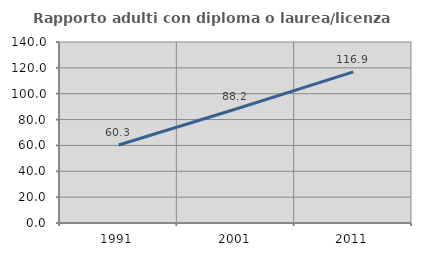
| Category | Rapporto adulti con diploma o laurea/licenza media  |
|---|---|
| 1991.0 | 60.296 |
| 2001.0 | 88.166 |
| 2011.0 | 116.87 |